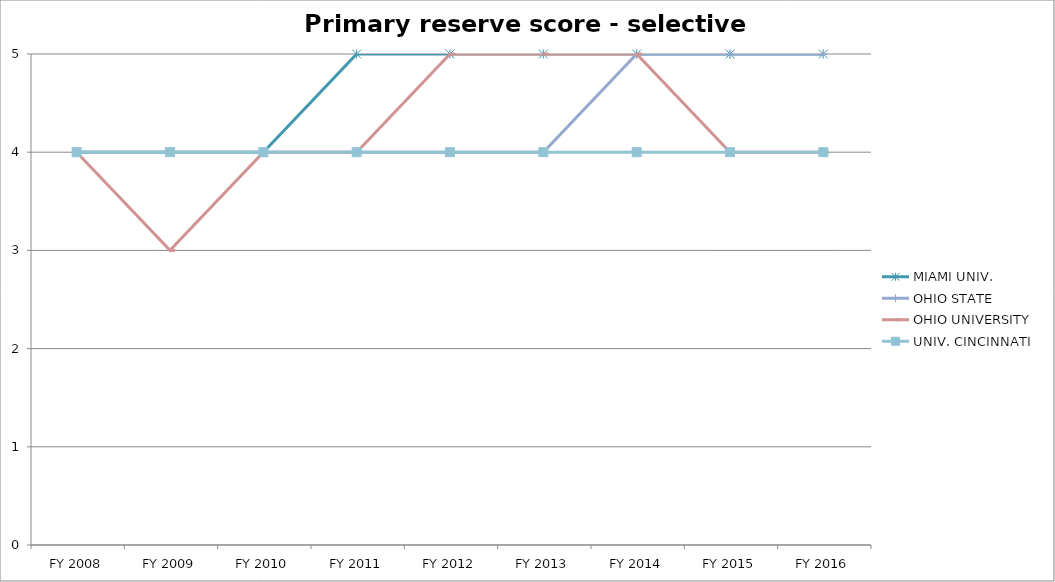
| Category | MIAMI UNIV.  | OHIO STATE  | OHIO UNIVERSITY  | UNIV. CINCINNATI  |
|---|---|---|---|---|
| FY 2016 | 5 | 5 | 4 | 4 |
| FY 2015 | 5 | 5 | 4 | 4 |
| FY 2014 | 5 | 5 | 5 | 4 |
| FY 2013 | 5 | 4 | 5 | 4 |
| FY 2012 | 5 | 4 | 5 | 4 |
| FY 2011 | 5 | 4 | 4 | 4 |
| FY 2010 | 4 | 4 | 4 | 4 |
| FY 2009 | 4 | 4 | 3 | 4 |
| FY 2008 | 4 | 4 | 4 | 4 |